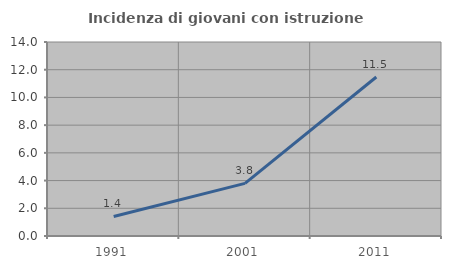
| Category | Incidenza di giovani con istruzione universitaria |
|---|---|
| 1991.0 | 1.408 |
| 2001.0 | 3.797 |
| 2011.0 | 11.475 |